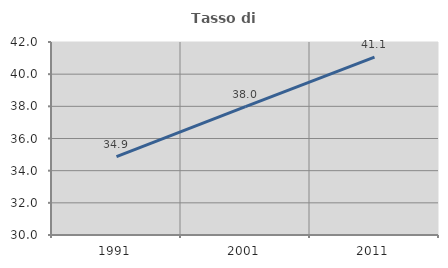
| Category | Tasso di occupazione   |
|---|---|
| 1991.0 | 34.879 |
| 2001.0 | 37.978 |
| 2011.0 | 41.065 |